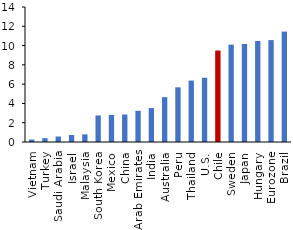
| Category | Series 0 |
|---|---|
| Vietnam | 0.254 |
| Turkey | 0.396 |
| Saudi Arabia | 0.568 |
| Israel | 0.723 |
| Malaysia | 0.793 |
| South Korea | 2.754 |
| Mexico | 2.812 |
| China | 2.852 |
| Arab Emirates | 3.233 |
| India | 3.515 |
| Australia | 4.651 |
| Peru | 5.669 |
| Thailand | 6.371 |
| U.S. | 6.663 |
| Chile | 9.488 |
| Sweden | 10.096 |
| Japan | 10.166 |
| Hungary | 10.481 |
| Eurozone | 10.569 |
| Brazil | 11.45 |